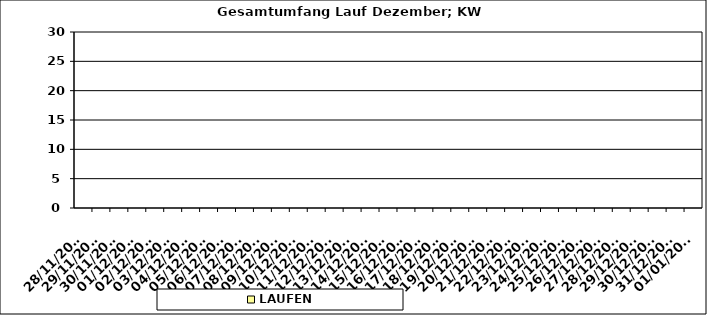
| Category | LAUFEN |
|---|---|
| 28/11/2022 | 0 |
| 29/11/2022 | 0 |
| 30/11/2022 | 0 |
| 01/12/2022 | 0 |
| 02/12/2022 | 0 |
| 03/12/2022 | 0 |
| 04/12/2022 | 0 |
| 05/12/2022 | 0 |
| 06/12/2022 | 0 |
| 07/12/2022 | 0 |
| 08/12/2022 | 0 |
| 09/12/2022 | 0 |
| 10/12/2022 | 0 |
| 11/12/2022 | 0 |
| 12/12/2022 | 0 |
| 13/12/2022 | 0 |
| 14/12/2022 | 0 |
| 15/12/2022 | 0 |
| 16/12/2022 | 0 |
| 17/12/2022 | 0 |
| 18/12/2022 | 0 |
| 19/12/2022 | 0 |
| 20/12/2022 | 0 |
| 21/12/2022 | 0 |
| 22/12/2022 | 0 |
| 23/12/2022 | 0 |
| 24/12/2022 | 0 |
| 25/12/2022 | 0 |
| 26/12/2022 | 0 |
| 27/12/2022 | 0 |
| 28/12/2022 | 0 |
| 29/12/2022 | 0 |
| 30/12/2022 | 0 |
| 31/12/2022 | 0 |
| 01/01/2023 | 0 |